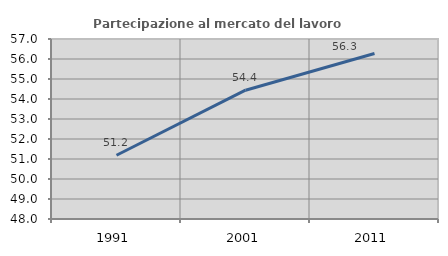
| Category | Partecipazione al mercato del lavoro  femminile |
|---|---|
| 1991.0 | 51.186 |
| 2001.0 | 54.44 |
| 2011.0 | 56.272 |